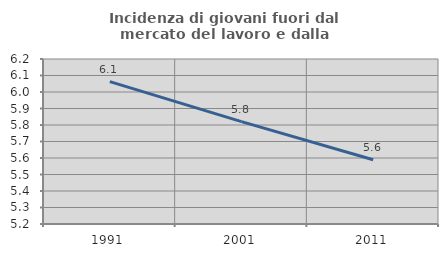
| Category | Incidenza di giovani fuori dal mercato del lavoro e dalla formazione  |
|---|---|
| 1991.0 | 6.063 |
| 2001.0 | 5.821 |
| 2011.0 | 5.59 |